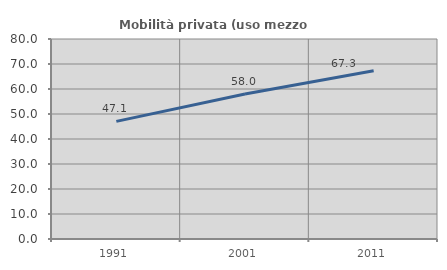
| Category | Mobilità privata (uso mezzo privato) |
|---|---|
| 1991.0 | 47.052 |
| 2001.0 | 58.014 |
| 2011.0 | 67.329 |